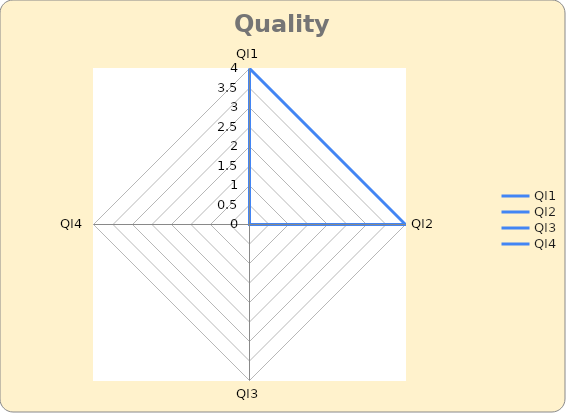
| Category | Series 0 |
|---|---|
| QI1 | 4 |
| QI2 | 4 |
| QI3 | 0 |
| QI4 | 0 |